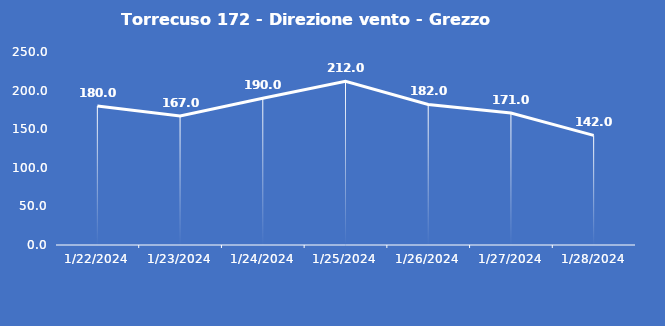
| Category | Torrecuso 172 - Direzione vento - Grezzo (°N) |
|---|---|
| 1/22/24 | 180 |
| 1/23/24 | 167 |
| 1/24/24 | 190 |
| 1/25/24 | 212 |
| 1/26/24 | 182 |
| 1/27/24 | 171 |
| 1/28/24 | 142 |